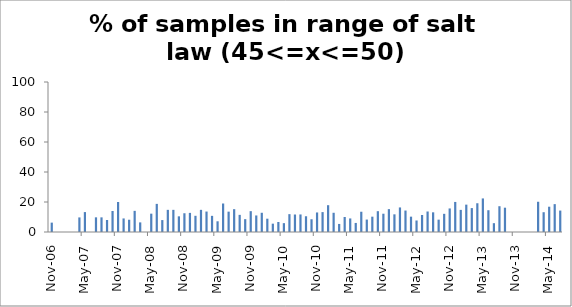
| Category | Series 0 |
|---|---|
| 2006-11-01 | 6.25 |
| 2006-12-01 | 0 |
| 2007-01-01 | 0 |
| 2007-02-01 | 0 |
| 2007-03-01 | 0 |
| 2007-04-01 | 9.72 |
| 2007-05-01 | 13.28 |
| 2007-06-01 | 0 |
| 2007-07-01 | 9.78 |
| 2007-08-01 | 9.76 |
| 2007-09-01 | 8 |
| 2007-10-01 | 14 |
| 2007-11-01 | 20 |
| 2007-12-01 | 9.04 |
| 2008-01-01 | 8.18 |
| 2008-02-01 | 14.1 |
| 2008-03-01 | 6.41 |
| 2008-04-01 | 0 |
| 2008-05-01 | 12.22 |
| 2008-06-01 | 18.75 |
| 2008-07-01 | 7.95 |
| 2008-08-01 | 14.77 |
| 2008-09-01 | 14.77 |
| 2008-10-01 | 10.45 |
| 2008-11-01 | 12.5 |
| 2008-12-01 | 12.75 |
| 2009-01-01 | 10.8 |
| 2009-02-01 | 14.77 |
| 2009-03-01 | 13.64 |
| 2009-04-01 | 10.77 |
| 2009-05-01 | 7.14 |
| 2009-06-01 | 19 |
| 2009-07-01 | 13.57 |
| 2009-08-01 | 15.22 |
| 2009-09-01 | 11.43 |
| 2009-10-01 | 8.57 |
| 2009-11-01 | 13.89 |
| 2009-12-01 | 11.03 |
| 2010-01-01 | 12.82 |
| 2010-02-01 | 8.87 |
| 2010-03-01 | 5.56 |
| 2010-04-01 | 6.67 |
| 2010-05-01 | 5.9 |
| 2010-06-01 | 11.9 |
| 2010-07-01 | 11.67 |
| 2010-08-01 | 11.7 |
| 2010-09-01 | 10.5 |
| 2010-10-01 | 8.5 |
| 2010-11-01 | 13.03 |
| 2010-12-01 | 13.26 |
| 2011-01-01 | 17.87 |
| 2011-02-01 | 12.82 |
| 2011-03-01 | 5.37 |
| 2011-04-01 | 10 |
| 2011-05-01 | 9.04 |
| 2011-06-01 | 6.04 |
| 2011-07-01 | 13.51 |
| 2011-08-01 | 8.29 |
| 2011-09-01 | 10.22 |
| 2011-10-01 | 13.88 |
| 2011-11-01 | 12.19 |
| 2011-12-01 | 15.24 |
| 2012-01-01 | 11.78 |
| 2012-02-01 | 16.37 |
| 2012-03-01 | 14.31 |
| 2012-04-01 | 10.23 |
| 2012-05-01 | 7.68 |
| 2012-06-01 | 11.33 |
| 2012-07-01 | 13.67 |
| 2012-08-01 | 13.12 |
| 2012-09-01 | 8.23 |
| 2012-10-01 | 12.12 |
| 2012-11-01 | 15.7 |
| 2012-12-01 | 20.04 |
| 2013-01-01 | 14.74 |
| 2013-02-01 | 18.24 |
| 2013-03-01 | 15.94 |
| 2013-04-01 | 19.17 |
| 2013-05-01 | 22.38 |
| 2013-06-01 | 14.52 |
| 2013-07-01 | 5.88 |
| 2013-08-01 | 17.19 |
| 2013-09-01 | 16.21 |
| 2013-10-01 | 0 |
| 2013-11-01 | 0 |
| 2013-12-01 | 0 |
| 2014-01-01 | 0 |
| 2014-02-01 | 0 |
| 2014-03-01 | 20.16 |
| 2014-04-01 | 13.19 |
| 2014-05-01 | 16.86 |
| 2014-06-01 | 18.58 |
| 2014-07-01 | 14.29 |